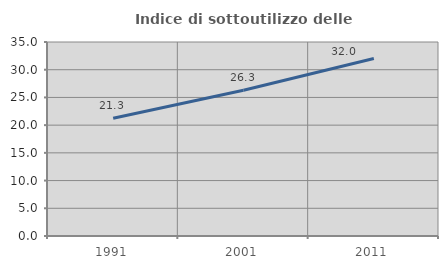
| Category | Indice di sottoutilizzo delle abitazioni  |
|---|---|
| 1991.0 | 21.252 |
| 2001.0 | 26.292 |
| 2011.0 | 32.014 |